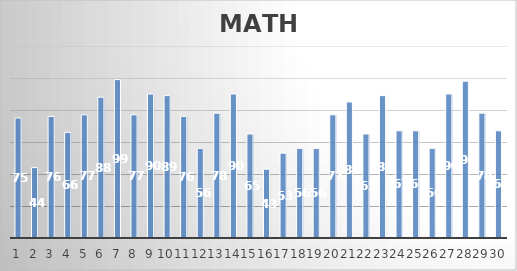
| Category | MATH |
|---|---|
| 0 | 75 |
| 1 | 44 |
| 2 | 76 |
| 3 | 66 |
| 4 | 77 |
| 5 | 88 |
| 6 | 99 |
| 7 | 77 |
| 8 | 90 |
| 9 | 89 |
| 10 | 76 |
| 11 | 56 |
| 12 | 78 |
| 13 | 90 |
| 14 | 65 |
| 15 | 43 |
| 16 | 53 |
| 17 | 56 |
| 18 | 56 |
| 19 | 77 |
| 20 | 85 |
| 21 | 65 |
| 22 | 89 |
| 23 | 67 |
| 24 | 67 |
| 25 | 56 |
| 26 | 90 |
| 27 | 98 |
| 28 | 78 |
| 29 | 67 |